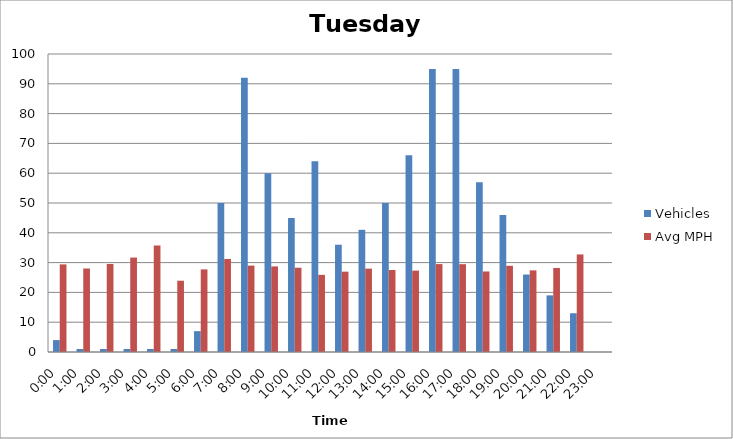
| Category | Vehicles | Avg MPH |
|---|---|---|
| 0:00 | 4 | 29.4 |
| 1:00 | 1 | 28.02 |
| 2:00 | 1 | 29.55 |
| 3:00 | 1 | 31.69 |
| 4:00 | 1 | 35.74 |
| 5:00 | 1 | 23.92 |
| 6:00 | 7 | 27.72 |
| 7:00 | 50 | 31.2 |
| 8:00 | 92 | 28.99 |
| 9:00 | 60 | 28.72 |
| 10:00 | 45 | 28.28 |
| 11:00 | 64 | 25.89 |
| 12:00 | 36 | 26.96 |
| 13:00 | 41 | 27.98 |
| 14:00 | 50 | 27.52 |
| 15:00 | 66 | 27.31 |
| 16:00 | 95 | 29.5 |
| 17:00 | 95 | 29.47 |
| 18:00 | 57 | 27.02 |
| 19:00 | 46 | 28.93 |
| 20:00 | 26 | 27.4 |
| 21:00 | 19 | 28.2 |
| 22:00 | 13 | 32.74 |
| 23:00 | 0 | 0 |